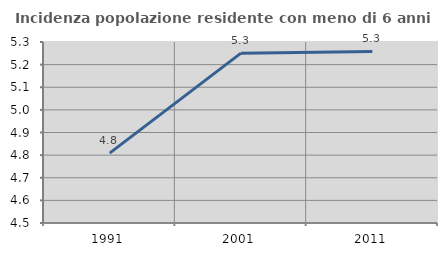
| Category | Incidenza popolazione residente con meno di 6 anni |
|---|---|
| 1991.0 | 4.809 |
| 2001.0 | 5.251 |
| 2011.0 | 5.258 |